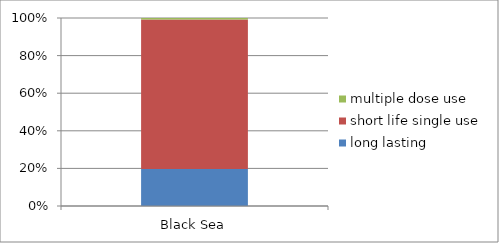
| Category | long lasting | short life single use | multiple dose use |
|---|---|---|---|
| Black Sea | 1254 | 5079 | 54 |